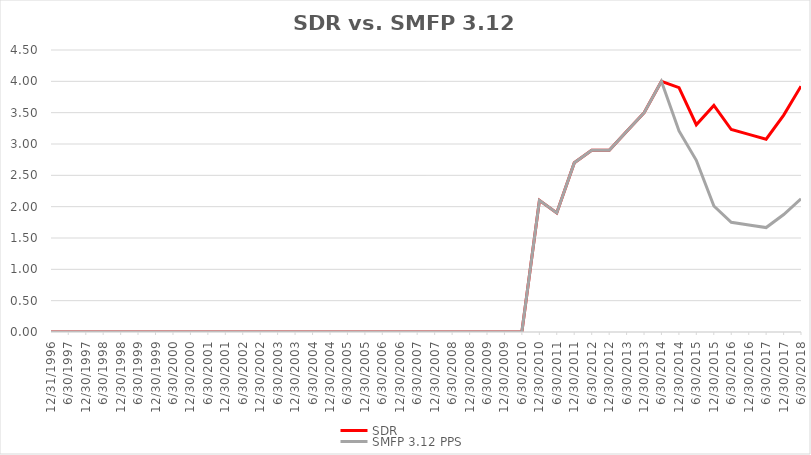
| Category | SDR | SMFP 3.12 PPS |
|---|---|---|
| 12/31/96 | 0 | 0 |
| 6/30/97 | 0 | 0 |
| 12/31/97 | 0 | 0 |
| 6/30/98 | 0 | 0 |
| 12/31/98 | 0 | 0 |
| 6/30/99 | 0 | 0 |
| 12/31/99 | 0 | 0 |
| 6/30/00 | 0 | 0 |
| 12/31/00 | 0 | 0 |
| 6/30/01 | 0 | 0 |
| 12/31/01 | 0 | 0 |
| 6/30/02 | 0 | 0 |
| 12/31/02 | 0 | 0 |
| 6/30/03 | 0 | 0 |
| 12/31/03 | 0 | 0 |
| 6/30/04 | 0 | 0 |
| 12/31/04 | 0 | 0 |
| 6/30/05 | 0 | 0 |
| 12/31/05 | 0 | 0 |
| 6/30/06 | 0 | 0 |
| 12/31/06 | 0 | 0 |
| 6/30/07 | 0 | 0 |
| 12/31/07 | 0 | 0 |
| 6/30/08 | 0 | 0 |
| 12/31/08 | 0 | 0 |
| 6/30/09 | 0 | 0 |
| 12/31/09 | 0 | 0 |
| 6/30/10 | 0 | 0 |
| 12/31/10 | 2.1 | 2.1 |
| 6/30/11 | 1.9 | 1.9 |
| 12/31/11 | 2.7 | 2.7 |
| 6/30/12 | 2.9 | 2.9 |
| 12/31/12 | 2.9 | 2.9 |
| 6/30/13 | 3.2 | 3.2 |
| 12/31/13 | 3.5 | 3.5 |
| 6/30/14 | 4 | 4 |
| 12/31/14 | 3.9 | 3.208 |
| 6/30/15 | 3.308 | 2.74 |
| 12/31/15 | 3.615 | 2.01 |
| 6/30/16 | 3.231 | 1.75 |
| 12/31/16 | 3.154 | 1.708 |
| 6/30/17 | 3.077 | 1.667 |
| 12/31/17 | 3.462 | 1.875 |
| 6/30/18 | 3.923 | 2.125 |